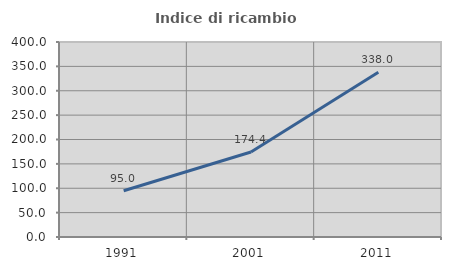
| Category | Indice di ricambio occupazionale  |
|---|---|
| 1991.0 | 94.973 |
| 2001.0 | 174.359 |
| 2011.0 | 338.032 |